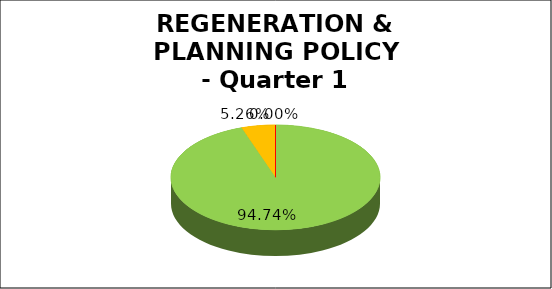
| Category | Q1 |
|---|---|
| Green | 0.947 |
| Amber | 0.053 |
| Red | 0 |